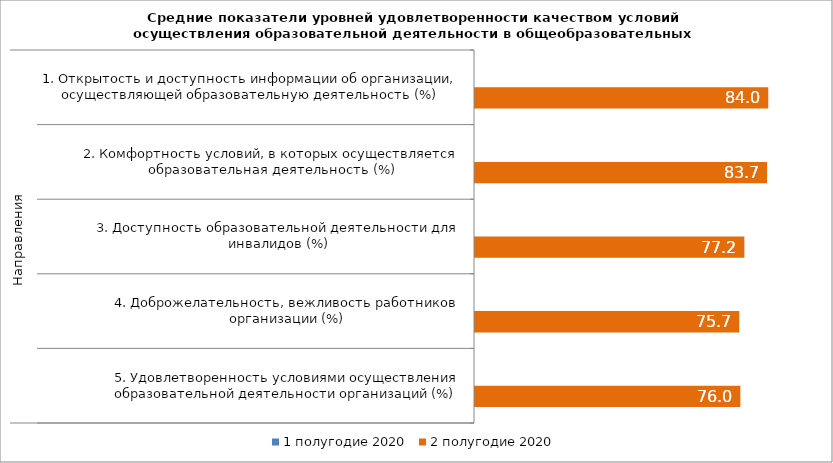
| Category | 1 полугодие 2020 | 2 полугодие 2020 |
|---|---|---|
| 0 | 0 | 84.03 |
| 1 | 0 | 83.686 |
| 2 | 0 | 77.182 |
| 3 | 0 | 75.718 |
| 4 | 0 | 76.033 |